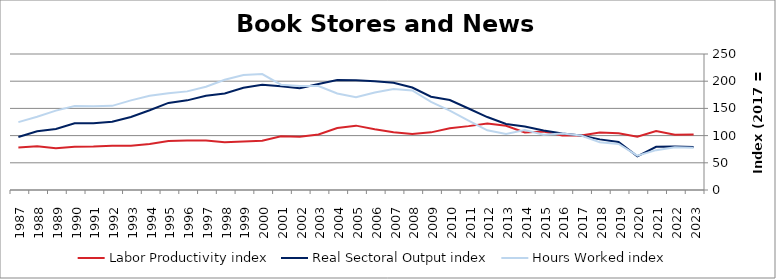
| Category | Labor Productivity index | Real Sectoral Output index | Hours Worked index |
|---|---|---|---|
| 2023.0 | 102.042 | 79.08 | 77.497 |
| 2022.0 | 101.507 | 79.861 | 78.675 |
| 2021.0 | 108.27 | 79.306 | 73.249 |
| 2020.0 | 97.903 | 61.77 | 63.093 |
| 2019.0 | 104.492 | 88.368 | 84.569 |
| 2018.0 | 105.822 | 93.038 | 87.92 |
| 2017.0 | 100 | 100 | 100 |
| 2016.0 | 100.116 | 103.757 | 103.637 |
| 2015.0 | 107.538 | 109.2 | 101.546 |
| 2014.0 | 105.821 | 116.648 | 110.231 |
| 2013.0 | 117.972 | 121.403 | 102.908 |
| 2012.0 | 122.295 | 134.116 | 109.666 |
| 2011.0 | 117.427 | 149.874 | 127.631 |
| 2010.0 | 113.355 | 165.494 | 145.997 |
| 2009.0 | 105.968 | 171.478 | 161.82 |
| 2008.0 | 102.984 | 188.438 | 182.978 |
| 2007.0 | 106.224 | 197.098 | 185.549 |
| 2006.0 | 111.592 | 200.051 | 179.27 |
| 2005.0 | 118.305 | 201.853 | 170.621 |
| 2004.0 | 114.019 | 202.204 | 177.343 |
| 2003.0 | 102.083 | 194.968 | 190.989 |
| 2002.0 | 97.783 | 187.064 | 191.304 |
| 2001.0 | 98.617 | 190.832 | 193.508 |
| 2000.0 | 90.731 | 193.259 | 213.004 |
| 1999.0 | 88.97 | 187.946 | 211.245 |
| 1998.0 | 87.614 | 177.515 | 202.61 |
| 1997.0 | 91.194 | 173.158 | 189.878 |
| 1996.0 | 90.911 | 164.802 | 181.278 |
| 1995.0 | 90.02 | 160.052 | 177.796 |
| 1994.0 | 84.655 | 146.654 | 173.237 |
| 1993.0 | 81.417 | 134.129 | 164.743 |
| 1992.0 | 81.146 | 125.501 | 154.661 |
| 1991.0 | 79.742 | 122.701 | 153.872 |
| 1990.0 | 79.333 | 122.536 | 154.457 |
| 1989.0 | 76.79 | 112.018 | 145.876 |
| 1988.0 | 80.238 | 108.115 | 134.743 |
| 1987.0 | 78.078 | 97.441 | 124.8 |